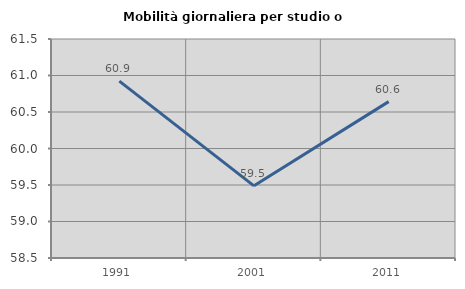
| Category | Mobilità giornaliera per studio o lavoro |
|---|---|
| 1991.0 | 60.923 |
| 2001.0 | 59.489 |
| 2011.0 | 60.642 |